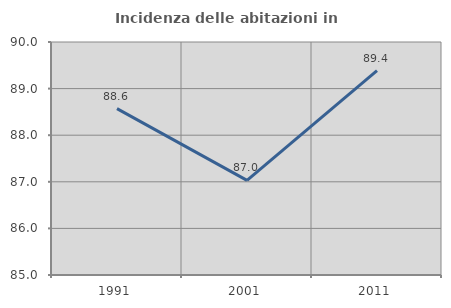
| Category | Incidenza delle abitazioni in proprietà  |
|---|---|
| 1991.0 | 88.571 |
| 2001.0 | 87.029 |
| 2011.0 | 89.388 |